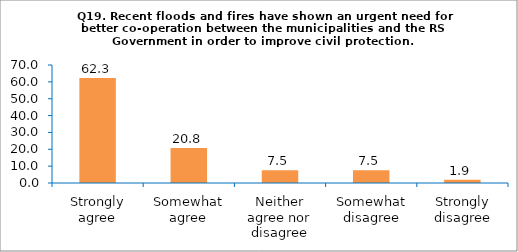
| Category | Series 0 |
|---|---|
| Strongly agree | 62.264 |
| Somewhat agree | 20.755 |
| Neither agree nor disagree | 7.547 |
| Somewhat disagree | 7.547 |
| Strongly disagree | 1.887 |